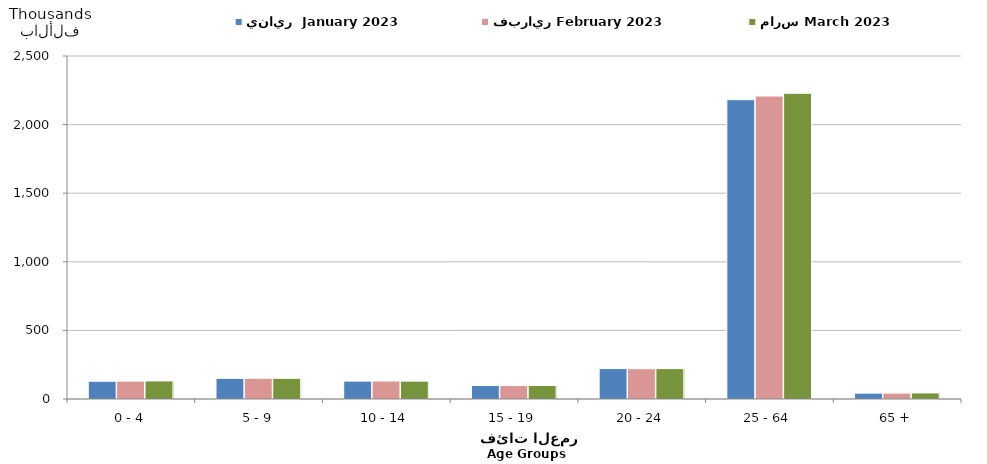
| Category | يناير  January 2023 | فبراير February 2023  | مارس March 2023  |
|---|---|---|---|
| 0 - 4 | 129514 | 130372 | 131615 |
| 5 - 9 | 150492 | 151225 | 150867 |
| 10 - 14 | 130425 | 131004 | 130370 |
| 15 - 19 | 98379 | 98051 | 98392 |
| 20 - 24 | 221798 | 220916 | 221516 |
| 25 - 64 | 2181614 | 2208170 | 2228069 |
| 65 + | 42725 | 42893 | 44240 |